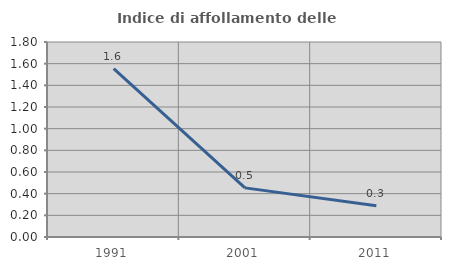
| Category | Indice di affollamento delle abitazioni  |
|---|---|
| 1991.0 | 1.554 |
| 2001.0 | 0.454 |
| 2011.0 | 0.288 |